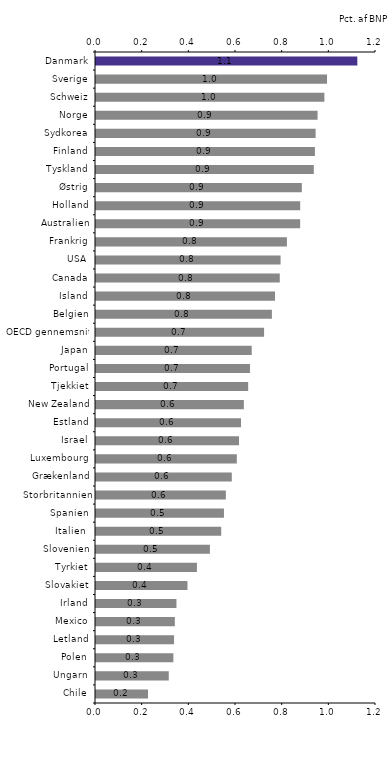
| Category | Offentlige FOU-investeringer |
|---|---|
| Chile | 0.223 |
| Ungarn | 0.312 |
| Polen | 0.331 |
| Letland | 0.335 |
| Mexico | 0.338 |
| Irland | 0.345 |
| Slovakiet | 0.392 |
| Tyrkiet | 0.433 |
| Slovenien | 0.488 |
| Italien  | 0.537 |
| Spanien | 0.548 |
| Storbritannien | 0.557 |
| Grækenland | 0.582 |
| Luxembourg | 0.604 |
| Israel | 0.613 |
| Estland | 0.622 |
| New Zealand | 0.634 |
| Tjekkiet | 0.652 |
| Portugal | 0.66 |
| Japan | 0.667 |
| OECD gennemsnit | 0.72 |
| Belgien | 0.754 |
| Island | 0.767 |
| Canada | 0.788 |
| USA | 0.791 |
| Frankrig | 0.818 |
| Australien | 0.875 |
| Holland | 0.875 |
| Østrig | 0.882 |
| Tyskland | 0.933 |
| Finland | 0.938 |
| Sydkorea | 0.941 |
| Norge | 0.95 |
| Schweiz | 0.979 |
| Sverige | 0.99 |
| Danmark | 1.12 |